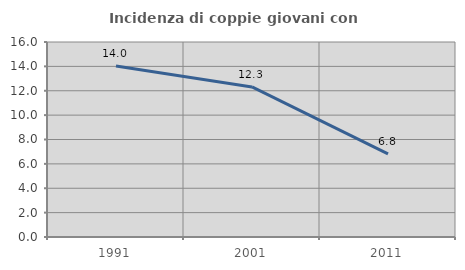
| Category | Incidenza di coppie giovani con figli |
|---|---|
| 1991.0 | 14.038 |
| 2001.0 | 12.311 |
| 2011.0 | 6.818 |